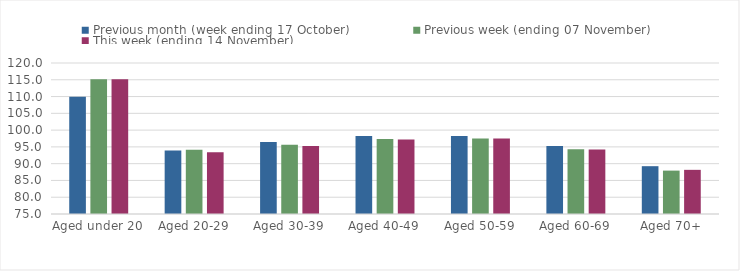
| Category | Previous month (week ending 17 October) | Previous week (ending 07 November) | This week (ending 14 November) |
|---|---|---|---|
| Aged under 20 | 109.92 | 115.13 | 115.17 |
| Aged 20-29 | 93.96 | 94.14 | 93.37 |
| Aged 30-39 | 96.49 | 95.61 | 95.24 |
| Aged 40-49 | 98.22 | 97.32 | 97.2 |
| Aged 50-59 | 98.22 | 97.48 | 97.5 |
| Aged 60-69 | 95.23 | 94.27 | 94.21 |
| Aged 70+ | 89.25 | 87.93 | 88.16 |